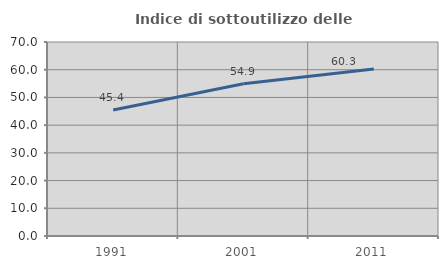
| Category | Indice di sottoutilizzo delle abitazioni  |
|---|---|
| 1991.0 | 45.442 |
| 2001.0 | 54.949 |
| 2011.0 | 60.285 |